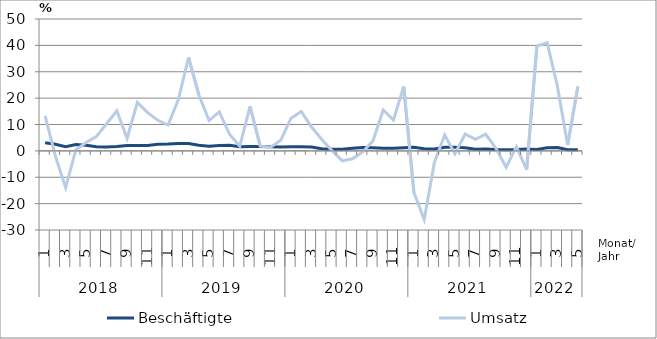
| Category | Beschäftigte | Umsatz |
|---|---|---|
| 0 | 3.1 | 13.3 |
| 1 | 2.5 | -2 |
| 2 | 1.6 | -13.9 |
| 3 | 2.4 | 0.4 |
| 4 | 2.1 | 3.2 |
| 5 | 1.6 | 5.4 |
| 6 | 1.5 | 10.3 |
| 7 | 1.7 | 15.2 |
| 8 | 2 | 4.7 |
| 9 | 2 | 18.4 |
| 10 | 2 | 14.5 |
| 11 | 2.5 | 11.6 |
| 12 | 2.6 | 9.8 |
| 13 | 2.8 | 19.4 |
| 14 | 2.8 | 35.4 |
| 15 | 2.1 | 21.3 |
| 16 | 1.8 | 11.5 |
| 17 | 2 | 14.8 |
| 18 | 2.1 | 6.3 |
| 19 | 1.6 | 1.7 |
| 20 | 1.7 | 16.9 |
| 21 | 1.7 | 1.8 |
| 22 | 1.6 | 1.4 |
| 23 | 1.5 | 4 |
| 24 | 1.6 | 12.4 |
| 25 | 1.6 | 14.9 |
| 26 | 1.5 | 9.1 |
| 27 | 0.8 | 4.3 |
| 28 | 0.6 | 0.1 |
| 29 | 0.6 | -3.8 |
| 30 | 1 | -3 |
| 31 | 1.3 | -0.4 |
| 32 | 1.2 | 3.8 |
| 33 | 1 | 15.5 |
| 34 | 1 | 11.7 |
| 35 | 1.2 | 24.4 |
| 36 | 1.4 | -15.8 |
| 37 | 0.8 | -26 |
| 38 | 0.7 | -4.3 |
| 39 | 1.4 | 6 |
| 40 | 1.4 | -1.1 |
| 41 | 1.2 | 6.4 |
| 42 | 0.6 | 4.4 |
| 43 | 0.7 | 6.3 |
| 44 | 0.5 | 1 |
| 45 | 0.4 | -6.2 |
| 46 | 0.5 | 1.6 |
| 47 | 0.7 | -7.1 |
| 48 | 0.5 | 39.7 |
| 49 | 1.2 | 41 |
| 50 | 1.3 | 24.6 |
| 51 | 0.4 | 2.2 |
| 52 | 0.4 | 24.4 |